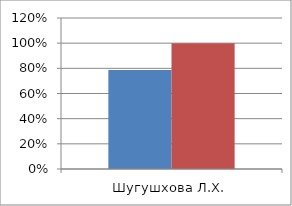
| Category | Series 0 | 2 |
|---|---|---|
| Шугушхова Л.Х. | 0.787 | 1 |